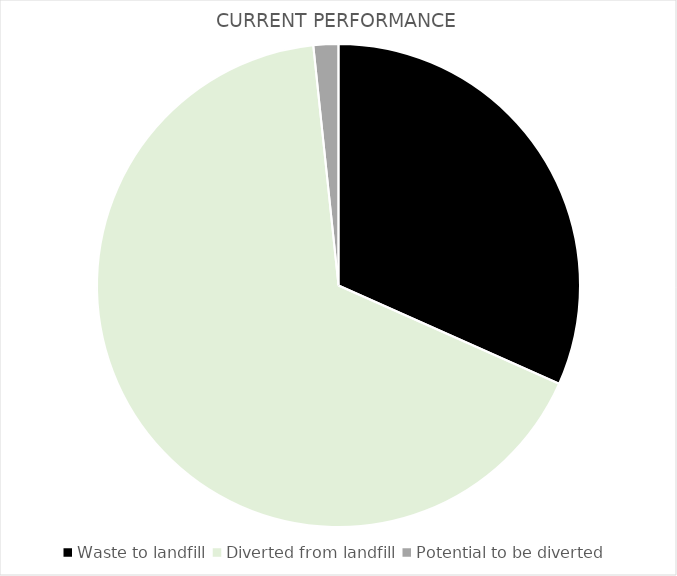
| Category | Series 0 |
|---|---|
| Waste to landfill | 0.317 |
| Diverted from landfill | 0.667 |
| Potential to be diverted | 0.017 |